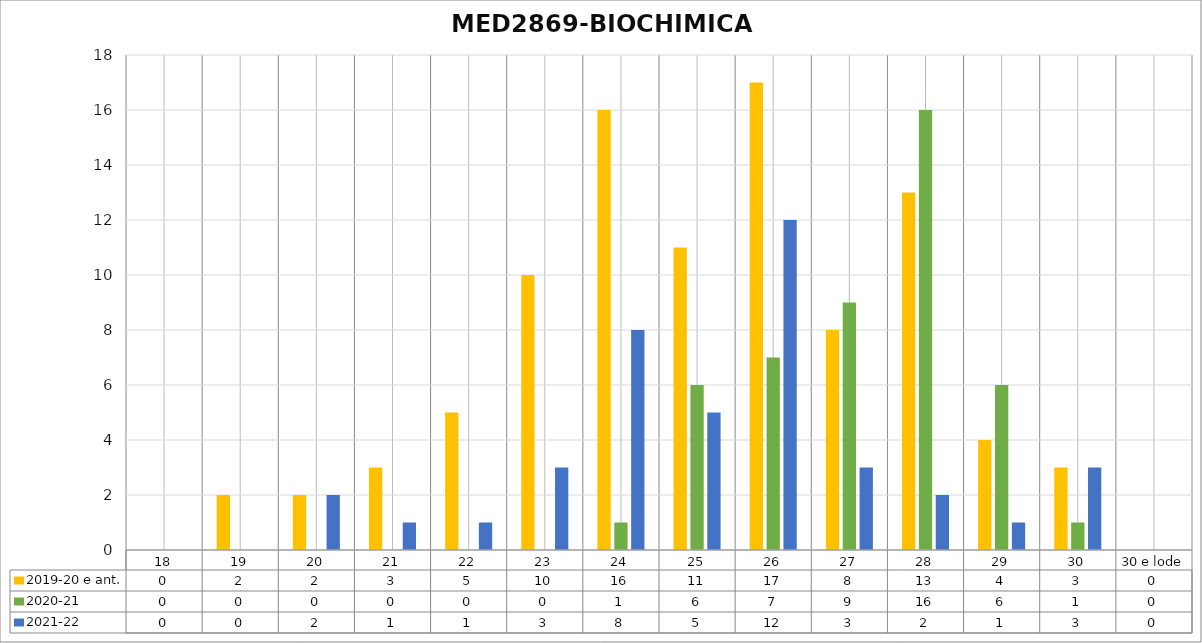
| Category | 2019-20 e ant. | 2020-21 | 2021-22 |
|---|---|---|---|
| 18 | 0 | 0 | 0 |
| 19 | 2 | 0 | 0 |
| 20 | 2 | 0 | 2 |
| 21 | 3 | 0 | 1 |
| 22 | 5 | 0 | 1 |
| 23 | 10 | 0 | 3 |
| 24 | 16 | 1 | 8 |
| 25 | 11 | 6 | 5 |
| 26 | 17 | 7 | 12 |
| 27 | 8 | 9 | 3 |
| 28 | 13 | 16 | 2 |
| 29 | 4 | 6 | 1 |
| 30 | 3 | 1 | 3 |
| 30 e lode | 0 | 0 | 0 |